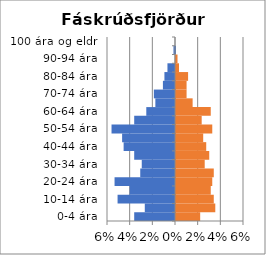
| Category | % karlar | %konur |
|---|---|---|
| 0-4 ára | -0.036 | 0.021 |
| 5-9 ára | -0.027 | 0.035 |
| 10-14 ára | -0.051 | 0.033 |
| 15-19 ára | -0.04 | 0.031 |
| 20-24 ára | -0.053 | 0.032 |
| 25-29 ára | -0.031 | 0.033 |
| 30-34 ára | -0.029 | 0.025 |
| 35-39 ára | -0.036 | 0.029 |
| 40-44 ára | -0.045 | 0.027 |
| 45-49 ára | -0.047 | 0.024 |
| 50-54 ára | -0.056 | 0.032 |
| 55-59 ára | -0.036 | 0.023 |
| 60-64 ára | -0.025 | 0.031 |
| 65-69 ára | -0.017 | 0.015 |
| 70-74 ára | -0.019 | 0.009 |
| 75-79 ára | -0.011 | 0.009 |
| 80-84 ára | -0.009 | 0.011 |
| 85-89 ára | -0.007 | 0.003 |
| 90-94 ára | 0 | 0.001 |
| 95-99 ára | -0.001 | 0 |
| 100 ára og eldri | 0 | 0 |